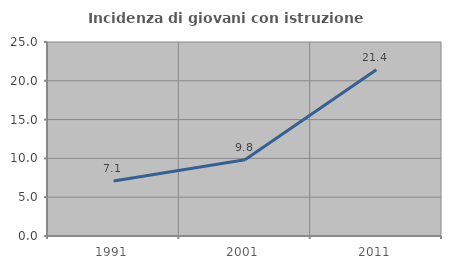
| Category | Incidenza di giovani con istruzione universitaria |
|---|---|
| 1991.0 | 7.081 |
| 2001.0 | 9.838 |
| 2011.0 | 21.426 |